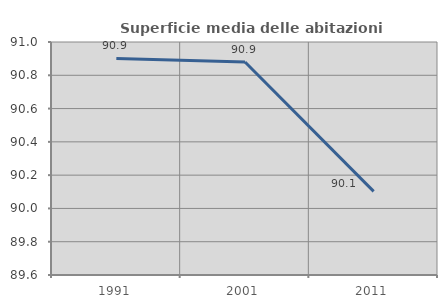
| Category | Superficie media delle abitazioni occupate |
|---|---|
| 1991.0 | 90.901 |
| 2001.0 | 90.88 |
| 2011.0 | 90.102 |